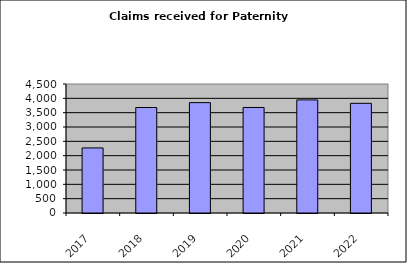
| Category | Series 0 |
|---|---|
| 2017.0 | 2270 |
| 2018.0 | 3680 |
| 2019.0 | 3850 |
| 2020.0 | 3681 |
| 2021.0 | 3945 |
| 2022.0 | 3826 |